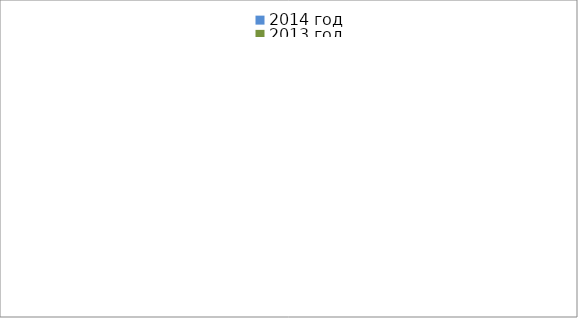
| Category | 2014 год | 2013 год |
|---|---|---|
|  - поджог | 10 | 20 |
|  - неосторожное обращение с огнём | 17 | 25 |
|  - НПТЭ электрооборудования | 12 | 18 |
|  - НПУ и Э печей | 42 | 34 |
|  - НПУ и Э транспортных средств | 37 | 42 |
|   -Шалость с огнем детей | 0 | 3 |
|  -НППБ при эксплуатации эл.приборов | 16 | 17 |
|  - курение | 10 | 8 |
| - прочие | 53 | 45 |
| - не установленные причины | 9 | 1 |